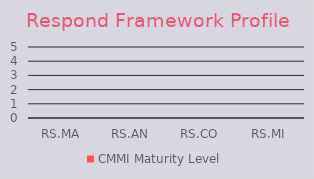
| Category | CMMI Maturity Level |
|---|---|
| RS.MA | 0 |
| RS.AN | 0 |
| RS.CO | 0 |
| RS.MI | 0 |